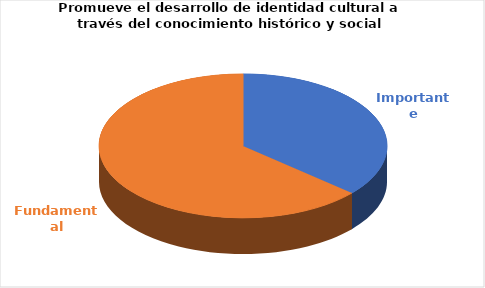
| Category | Series 0 |
|---|---|
| Importante | 4 |
| Fundamental | 7 |